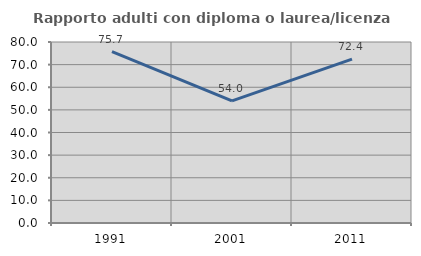
| Category | Rapporto adulti con diploma o laurea/licenza media  |
|---|---|
| 1991.0 | 75.714 |
| 2001.0 | 54 |
| 2011.0 | 72.441 |